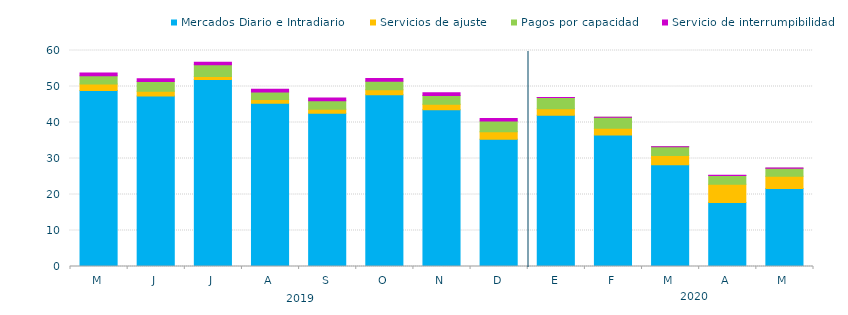
| Category | Mercados Diario e Intradiario  | Servicios de ajuste | Pagos por capacidad | Servicio de interrumpibilidad |
|---|---|---|---|---|
| M | 48.92 | 1.8 | 2.3 | 0.75 |
| J | 47.39 | 1.3 | 2.7 | 0.75 |
| J | 51.96 | 0.81 | 3.25 | 0.69 |
| A | 45.37 | 1.03 | 2.1 | 0.73 |
| S | 42.58 | 1.08 | 2.38 | 0.78 |
| O | 47.72 | 1.38 | 2.33 | 0.77 |
| N | 43.56 | 1.51 | 2.43 | 0.75 |
| D | 35.33 | 2.07 | 3 | 0.74 |
| E | 42.04 | 1.79 | 3.11 | 0.03 |
| F | 36.51 | 1.86 | 3.06 | 0.04 |
| M | 28.27 | 2.56 | 2.41 | 0.04 |
| A | 17.8 | 5.06 | 2.43 | 0.04 |
| M | 21.68 | 3.37 | 2.24 | 0.04 |